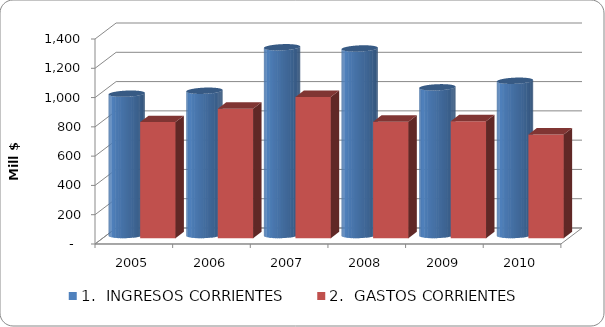
| Category | 1.  INGRESOS CORRIENTES | 2.  GASTOS CORRIENTES |
|---|---|---|
| 2005 | 965.208 | 792.746 |
| 2006 | 985.279 | 884.864 |
| 2007 | 1282.209 | 964.528 |
| 2008 | 1274.009 | 795.655 |
| 2009 | 1008.682 | 799.237 |
| 2010 | 1053.502 | 708.912 |